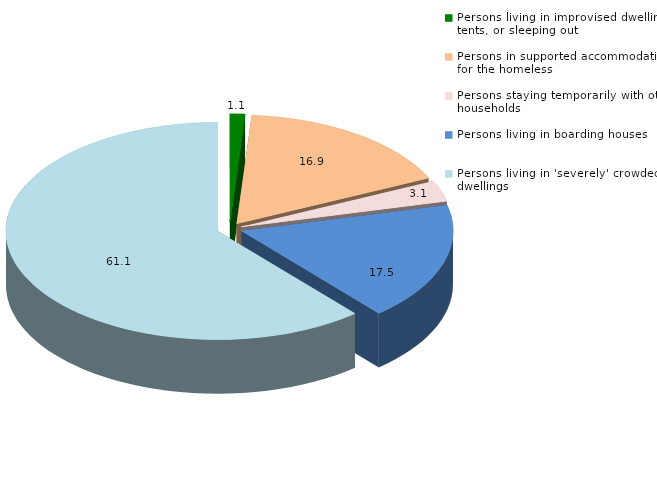
| Category | Series 0 |
|---|---|
| Persons living in improvised dwellings, tents, or sleeping out | 1.141 |
| Persons in supported accommodation for the homeless | 16.881 |
| Persons staying temporarily with other households | 3.091 |
| Persons living in boarding houses | 17.499 |
| Persons living in 'severely' crowded dwellings | 61.056 |